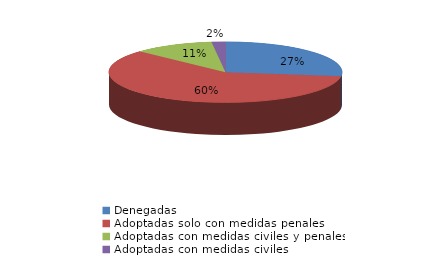
| Category | Series 0 |
|---|---|
| Denegadas | 100 |
| Adoptadas solo con medidas penales | 220 |
| Adoptadas con medidas civiles y penales | 41 |
| Adoptadas con medidas civiles | 7 |